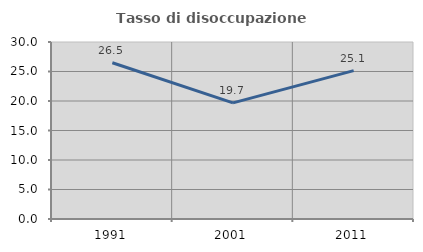
| Category | Tasso di disoccupazione giovanile  |
|---|---|
| 1991.0 | 26.486 |
| 2001.0 | 19.681 |
| 2011.0 | 25.15 |